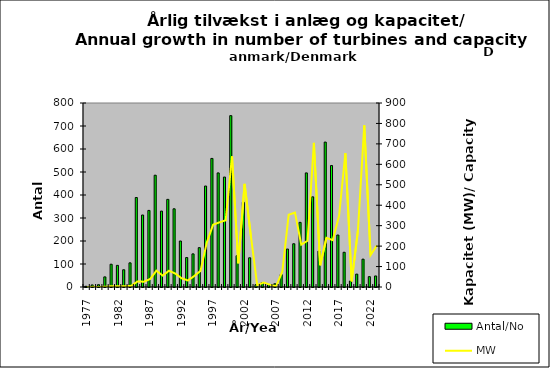
| Category | Antal/No |
|---|---|
| 1977.0 | 3 |
| 1978.0 | 9 |
| 1979.0 | 10 |
| 1980.0 | 44 |
| 1981.0 | 99 |
| 1982.0 | 94 |
| 1983.0 | 75 |
| 1984.0 | 105 |
| 1985.0 | 389 |
| 1986.0 | 313 |
| 1987.0 | 333 |
| 1988.0 | 486 |
| 1989.0 | 330 |
| 1990.0 | 381 |
| 1991.0 | 340 |
| 1992.0 | 200 |
| 1993.0 | 128 |
| 1994.0 | 144 |
| 1995.0 | 171 |
| 1996.0 | 439 |
| 1997.0 | 559 |
| 1998.0 | 496 |
| 1999.0 | 478 |
| 2000.0 | 745 |
| 2001.0 | 136 |
| 2002.0 | 369 |
| 2003.0 | 127 |
| 2004.0 | 10 |
| 2005.0 | 19 |
| 2006.0 | 10 |
| 2007.0 | 14 |
| 2008.0 | 54 |
| 2009.0 | 165 |
| 2010.0 | 188 |
| 2011.0 | 281 |
| 2012.0 | 496 |
| 2013.0 | 392 |
| 2014.0 | 156 |
| 2015.0 | 630 |
| 2016.0 | 528 |
| 2017.0 | 226 |
| 2018.0 | 151 |
| 2019.0 | 26 |
| 2020.0 | 56 |
| 2021.0 | 121 |
| 2022.0 | 45 |
| 2023.0 | 48 |